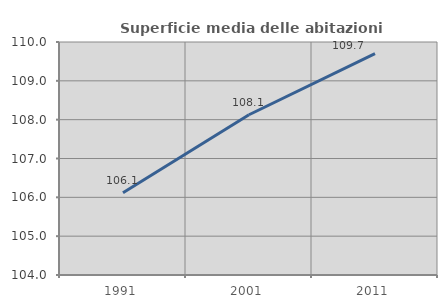
| Category | Superficie media delle abitazioni occupate |
|---|---|
| 1991.0 | 106.116 |
| 2001.0 | 108.127 |
| 2011.0 | 109.699 |